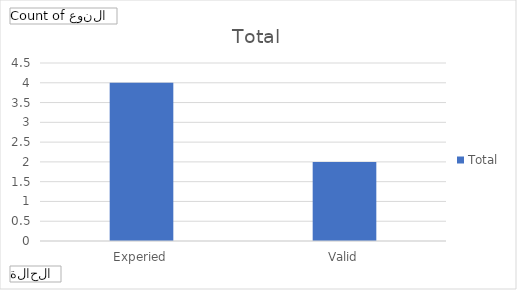
| Category | Total |
|---|---|
| Experied | 4 |
| Valid | 2 |